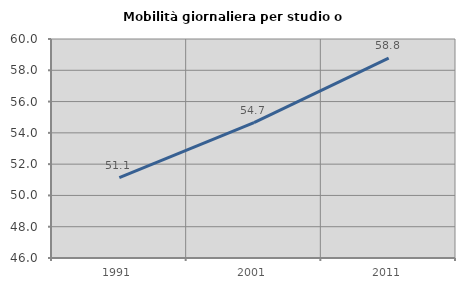
| Category | Mobilità giornaliera per studio o lavoro |
|---|---|
| 1991.0 | 51.141 |
| 2001.0 | 54.654 |
| 2011.0 | 58.777 |